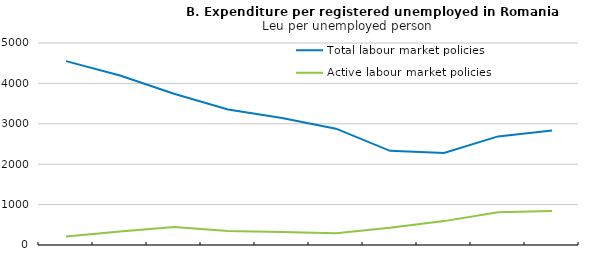
| Category | Total labour market policies | Active labour market policies |
|---|---|---|
|  | 4550.718 | 211.117 |
|  | 4195.224 | 333.269 |
|  | 3743.809 | 446.463 |
|  | 3354.801 | 343.851 |
|  | 3144.272 | 319.143 |
|  | 2879.269 | 292.567 |
|  | 2330.078 | 424.953 |
|  | 2279.506 | 591.21 |
|  | 2688.58 | 808.964 |
|  | 2833.232 | 842.34 |